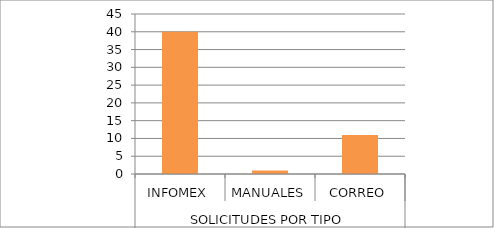
| Category | Series 0 |
|---|---|
| 0 | 40 |
| 1 | 1 |
| 2 | 11 |